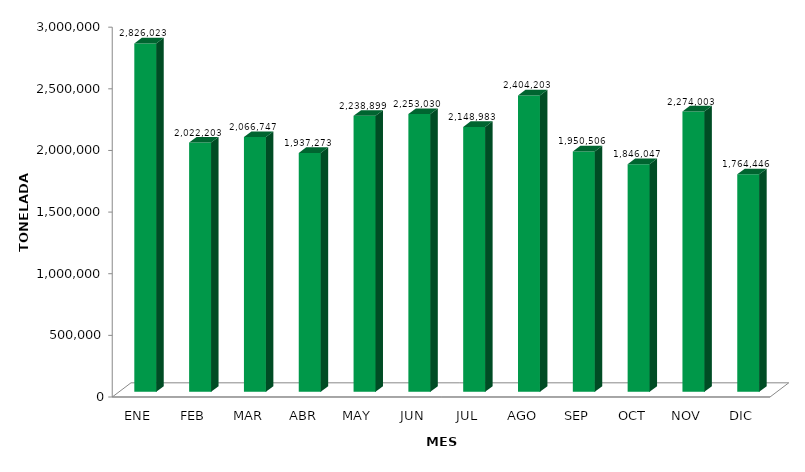
| Category | Series 0 |
|---|---|
| ENE | 2826023.301 |
| FEB | 2022202.905 |
| MAR | 2066746.535 |
| ABR | 1937272.659 |
| MAY | 2238898.859 |
| JUN | 2253029.774 |
| JUL | 2148982.904 |
| AGO | 2404202.715 |
| SEP | 1950505.666 |
| OCT | 1846047.201 |
| NOV | 2274002.726 |
| DIC | 1764445.805 |